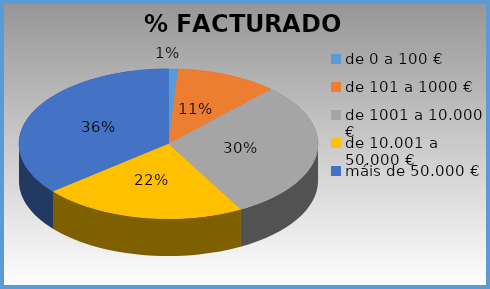
| Category | Series 0 |
|---|---|
| de 0 a 100 € | 0.01 |
| de 101 a 1000 € | 0.11 |
| de 1001 a 10.000 € | 0.3 |
| de 10.001 a 50.000 € | 0.22 |
| máis de 50.000 € | 0.36 |